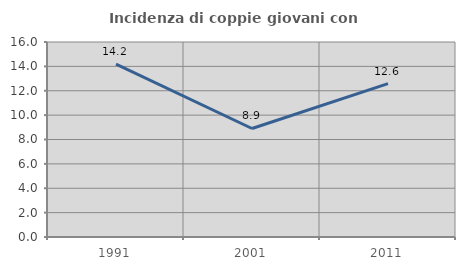
| Category | Incidenza di coppie giovani con figli |
|---|---|
| 1991.0 | 14.184 |
| 2001.0 | 8.904 |
| 2011.0 | 12.583 |